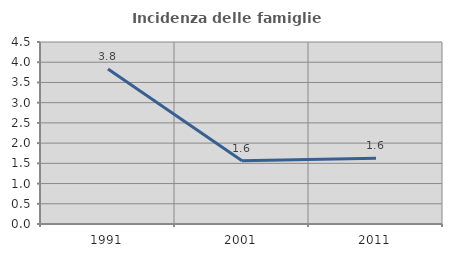
| Category | Incidenza delle famiglie numerose |
|---|---|
| 1991.0 | 3.83 |
| 2001.0 | 1.564 |
| 2011.0 | 1.626 |